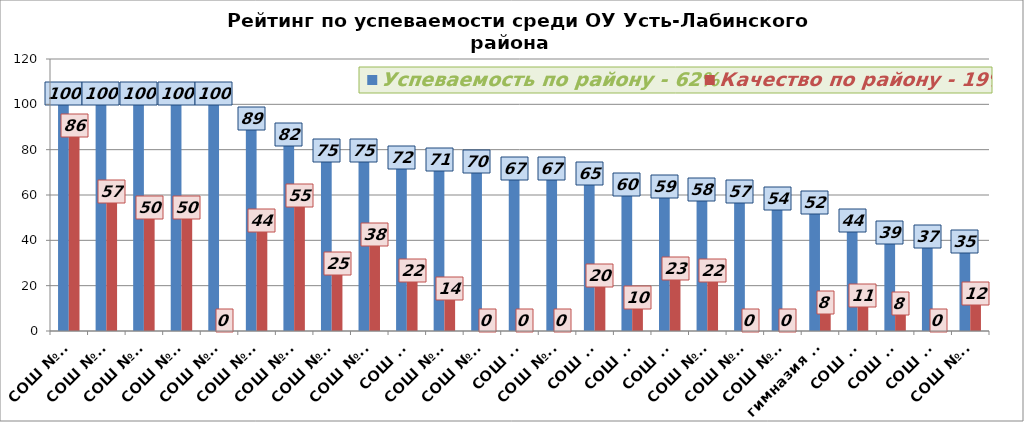
| Category | Успеваемость по району - 62% | Качество по району - 19% |
|---|---|---|
| СОШ №24 | 100 | 86 |
| СОШ №22 | 100 | 57 |
| СОШ №18 | 100 | 50 |
| СОШ №15 | 100 | 50 |
| СОШ №16 | 100 | 0 |
| СОШ №13 | 89 | 44 |
| СОШ №20 | 82 | 55 |
| СОШ №10 | 75 | 25 |
| СОШ №11 | 75 | 38 |
| СОШ №7 | 72 | 22 |
| СОШ №23 | 71 | 14 |
| СОШ №14 | 70 | 0 |
| СОШ №9 | 67 | 0 |
| СОШ №17 | 67 | 0 |
| СОШ №1 | 65 | 20 |
| СОШ №8 | 60 | 10 |
| СОШ №2 | 59 | 23 |
| СОШ №36 | 58 | 22 |
| СОШ №12 | 57 | 0 |
| СОШ №25 | 54 | 0 |
| гимназия №5 | 52 | 8 |
| СОШ №4 | 44 | 11 |
| СОШ №3 | 39 | 7.7 |
| СОШ №6 | 37 | 0 |
| СОШ №19 | 35 | 12 |